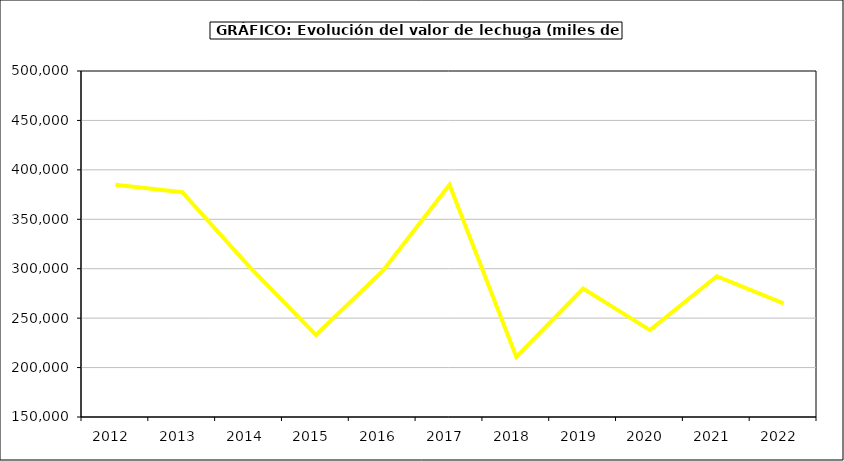
| Category | Valor |
|---|---|
| 2012.0 | 384970.514 |
| 2013.0 | 377357.296 |
| 2014.0 | 302294.348 |
| 2015.0 | 232957 |
| 2016.0 | 297768 |
| 2017.0 | 384880.962 |
| 2018.0 | 210768.085 |
| 2019.0 | 280000.972 |
| 2020.0 | 237887.267 |
| 2021.0 | 292431.748 |
| 2022.0 | 264929.436 |